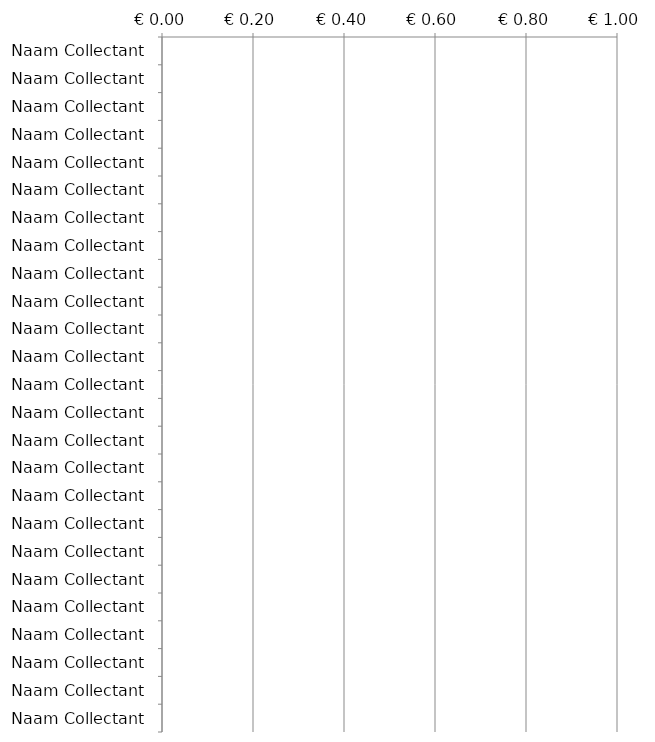
| Category | TOTAAL |
|---|---|
| Naam Collectant | 0 |
| Naam Collectant | 0 |
| Naam Collectant | 0 |
| Naam Collectant | 0 |
| Naam Collectant | 0 |
| Naam Collectant | 0 |
| Naam Collectant | 0 |
| Naam Collectant | 0 |
| Naam Collectant | 0 |
| Naam Collectant | 0 |
| Naam Collectant | 0 |
| Naam Collectant | 0 |
| Naam Collectant | 0 |
| Naam Collectant | 0 |
| Naam Collectant | 0 |
| Naam Collectant | 0 |
| Naam Collectant | 0 |
| Naam Collectant | 0 |
| Naam Collectant | 0 |
| Naam Collectant | 0 |
| Naam Collectant | 0 |
| Naam Collectant | 0 |
| Naam Collectant | 0 |
| Naam Collectant | 0 |
| Naam Collectant | 0 |